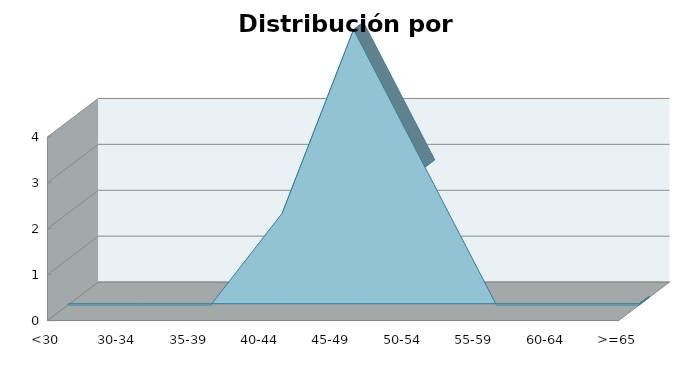
| Category | Series 1 |
|---|---|
| <30 | 0 |
| 30-34 | 0 |
| 35-39 | 0 |
| 40-44 | 2 |
| 45-49 | 6 |
| 50-54 | 3 |
| 55-59 | 0 |
| 60-64 | 0 |
| >=65 | 0 |